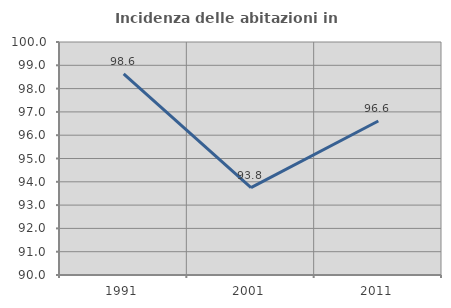
| Category | Incidenza delle abitazioni in proprietà  |
|---|---|
| 1991.0 | 98.63 |
| 2001.0 | 93.75 |
| 2011.0 | 96.61 |